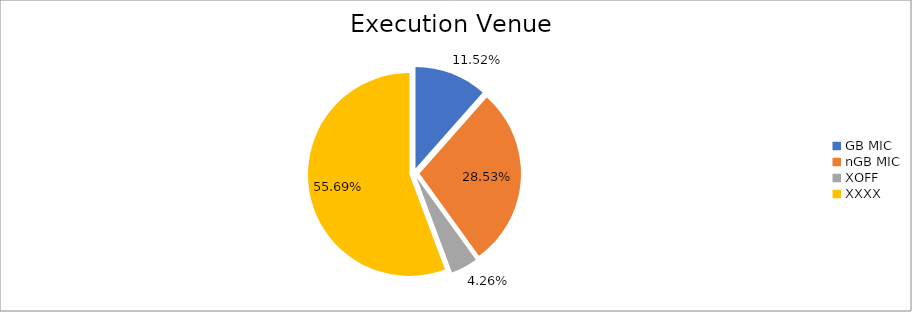
| Category | Series 0 |
|---|---|
| GB MIC | 1095505.916 |
| nGB MIC | 2713307.729 |
| XOFF | 404801.385 |
| XXXX | 5295800.009 |